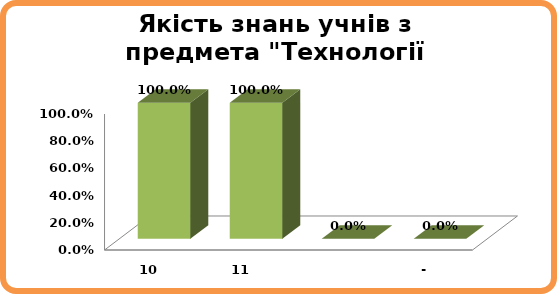
| Category | Series 0 |
|---|---|
| 10 | 1 |
| 11 | 1 |
|  | 0 |
| - | 0 |